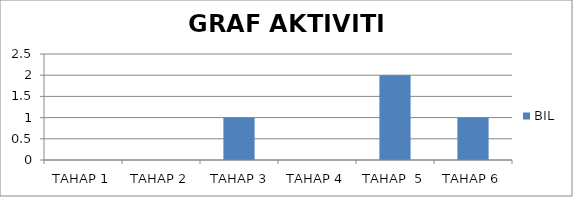
| Category | BIL |
|---|---|
| TAHAP 1 | 0 |
| TAHAP 2 | 0 |
|  TAHAP 3 | 1 |
| TAHAP 4 | 0 |
| TAHAP  5 | 2 |
| TAHAP 6 | 1 |